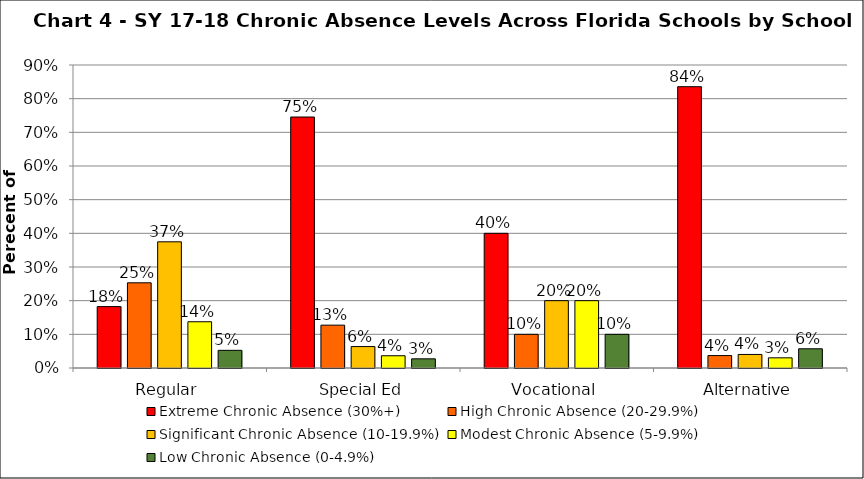
| Category | Extreme Chronic Absence (30%+) | High Chronic Absence (20-29.9%) | Significant Chronic Absence (10-19.9%) | Modest Chronic Absence (5-9.9%) | Low Chronic Absence (0-4.9%) |
|---|---|---|---|---|---|
| 0 | 0.182 | 0.253 | 0.375 | 0.137 | 0.052 |
| 1 | 0.745 | 0.127 | 0.064 | 0.036 | 0.027 |
| 2 | 0.4 | 0.1 | 0.2 | 0.2 | 0.1 |
| 3 | 0.836 | 0.037 | 0.04 | 0.03 | 0.057 |